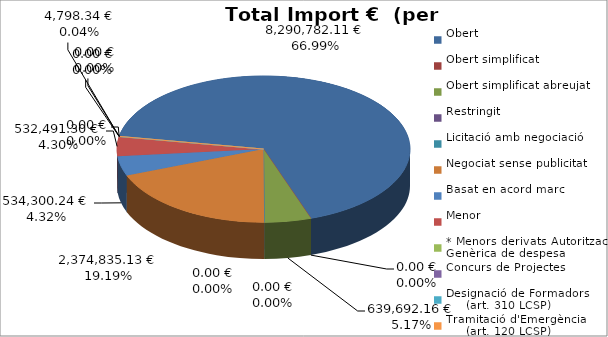
| Category | Total preu
(amb IVA) |
|---|---|
| Obert | 8290782.11 |
| Obert simplificat | 0 |
| Obert simplificat abreujat | 639692.16 |
| Restringit | 0 |
| Licitació amb negociació | 0 |
| Negociat sense publicitat | 2374835.13 |
| Basat en acord marc | 534300.24 |
| Menor | 532491.3 |
| * Menors derivats Autorització Genèrica de despesa | 0 |
| Concurs de Projectes | 0 |
| Designació de Formadors
     (art. 310 LCSP) | 4798.34 |
| Tramitació d'Emergència
     (art. 120 LCSP) | 0 |